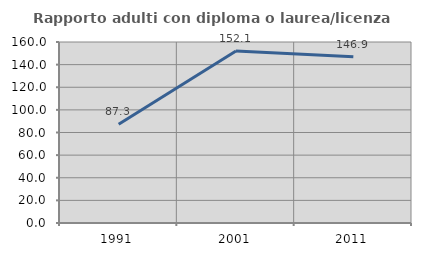
| Category | Rapporto adulti con diploma o laurea/licenza media  |
|---|---|
| 1991.0 | 87.302 |
| 2001.0 | 152.113 |
| 2011.0 | 146.875 |